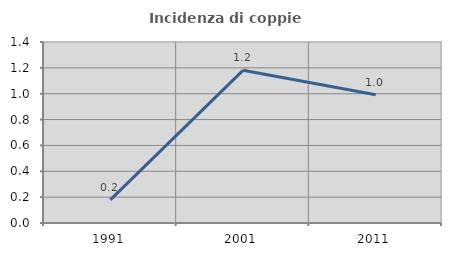
| Category | Incidenza di coppie miste |
|---|---|
| 1991.0 | 0.179 |
| 2001.0 | 1.181 |
| 2011.0 | 0.993 |